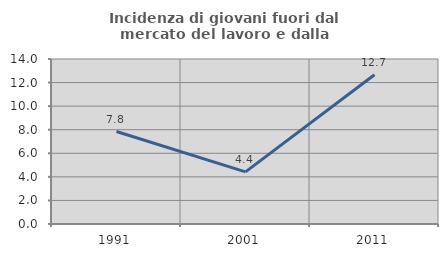
| Category | Incidenza di giovani fuori dal mercato del lavoro e dalla formazione  |
|---|---|
| 1991.0 | 7.846 |
| 2001.0 | 4.423 |
| 2011.0 | 12.658 |